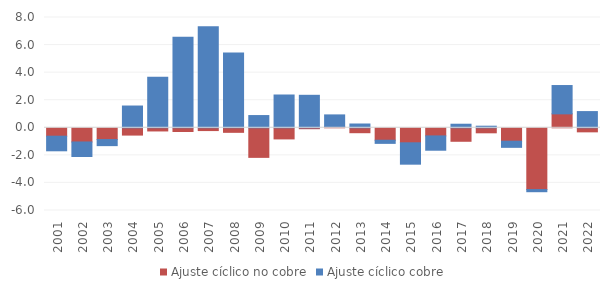
| Category | Ajuste cíclico no cobre | Ajuste cíclico cobre |
|---|---|---|
| 2001.0 | -0.61 | -1.059 |
| 2002.0 | -1.029 | -1.055 |
| 2003.0 | -0.854 | -0.441 |
| 2004.0 | -0.53 | 1.579 |
| 2005.0 | -0.23 | 3.657 |
| 2006.0 | -0.27 | 6.562 |
| 2007.0 | -0.202 | 7.331 |
| 2008.0 | -0.33 | 5.43 |
| 2009.0 | -2.146 | 0.887 |
| 2010.0 | -0.807 | 2.379 |
| 2011.0 | -0.067 | 2.356 |
| 2012.0 | 0.071 | 0.864 |
| 2013.0 | -0.357 | 0.275 |
| 2014.0 | -0.903 | -0.228 |
| 2015.0 | -1.089 | -1.551 |
| 2016.0 | -0.59 | -1.039 |
| 2017.0 | -0.979 | 0.259 |
| 2018.0 | -0.364 | 0.115 |
| 2019.0 | -0.973 | -0.446 |
| 2020.0 | -4.482 | -0.156 |
| 2021.0 | 1.011 | 2.055 |
| 2022.0 | -0.294 | 1.175 |